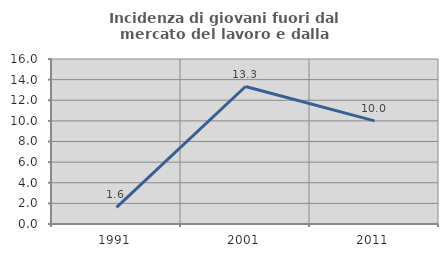
| Category | Incidenza di giovani fuori dal mercato del lavoro e dalla formazione  |
|---|---|
| 1991.0 | 1.613 |
| 2001.0 | 13.333 |
| 2011.0 | 10 |